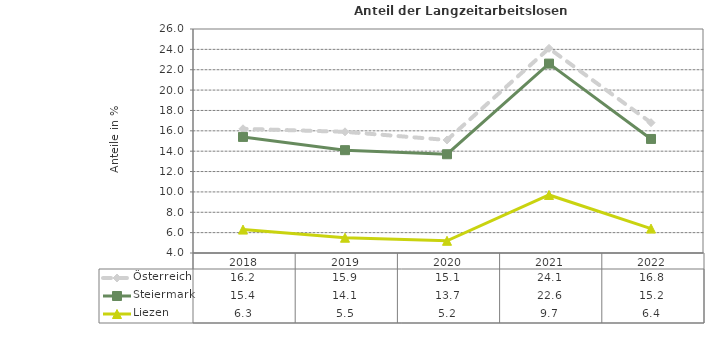
| Category | Österreich | Steiermark | Liezen |
|---|---|---|---|
| 2022.0 | 16.8 | 15.2 | 6.4 |
| 2021.0 | 24.1 | 22.6 | 9.7 |
| 2020.0 | 15.1 | 13.7 | 5.2 |
| 2019.0 | 15.9 | 14.1 | 5.5 |
| 2018.0 | 16.2 | 15.4 | 6.3 |